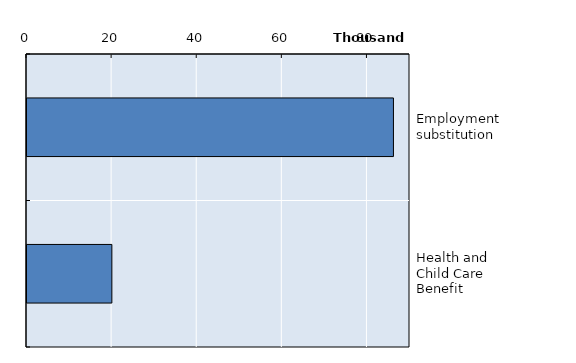
| Category | Series 0 |
|---|---|
| Employment substitution | 86109 |
| Health and Child Care Benefit | 19943 |